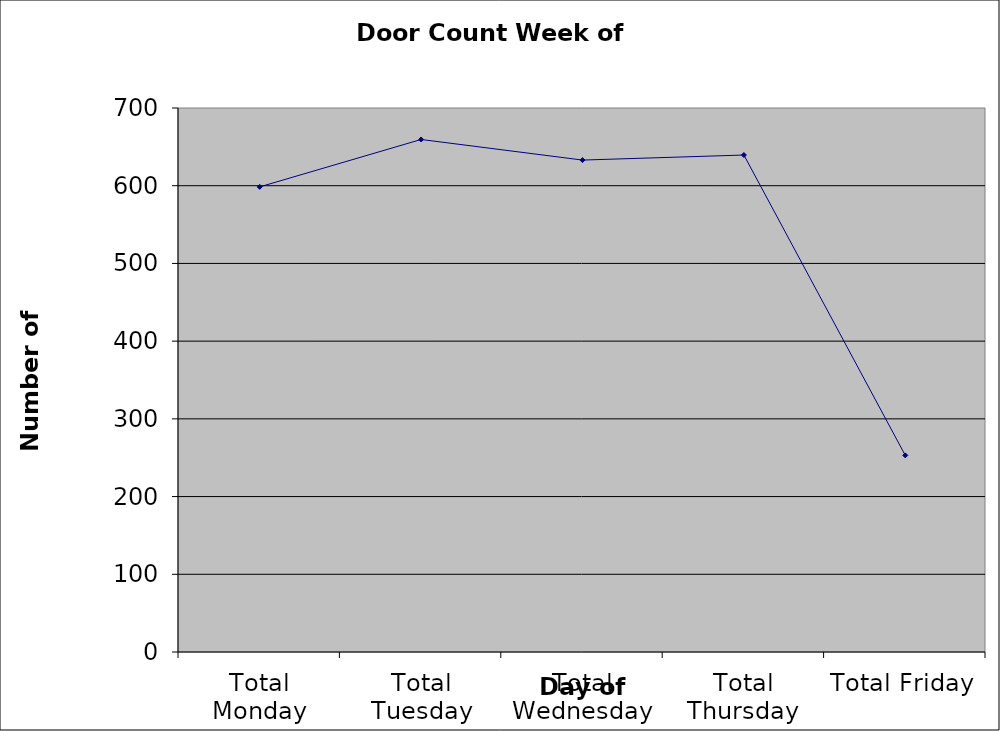
| Category | Series 0 |
|---|---|
| Total Monday | 598.5 |
| Total Tuesday | 659.5 |
| Total Wednesday | 633 |
| Total Thursday | 639.5 |
| Total Friday | 253 |